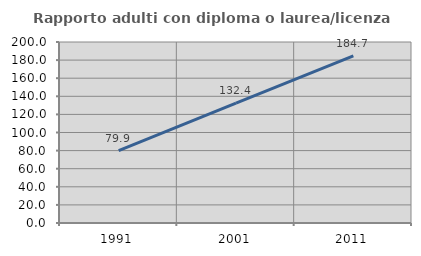
| Category | Rapporto adulti con diploma o laurea/licenza media  |
|---|---|
| 1991.0 | 79.853 |
| 2001.0 | 132.394 |
| 2011.0 | 184.708 |